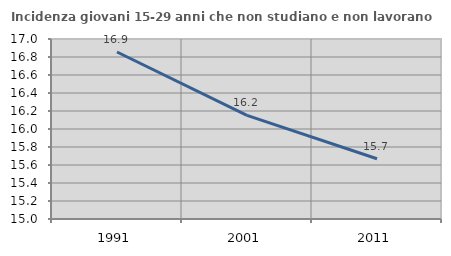
| Category | Incidenza giovani 15-29 anni che non studiano e non lavorano  |
|---|---|
| 1991.0 | 16.856 |
| 2001.0 | 16.152 |
| 2011.0 | 15.67 |